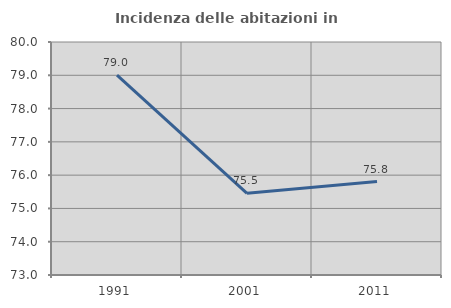
| Category | Incidenza delle abitazioni in proprietà  |
|---|---|
| 1991.0 | 79.003 |
| 2001.0 | 75.453 |
| 2011.0 | 75.809 |